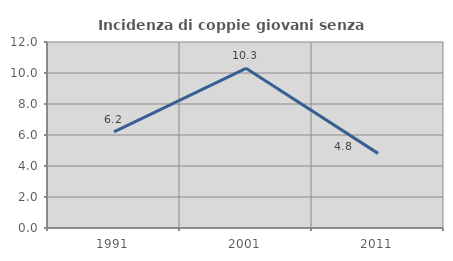
| Category | Incidenza di coppie giovani senza figli |
|---|---|
| 1991.0 | 6.199 |
| 2001.0 | 10.302 |
| 2011.0 | 4.815 |